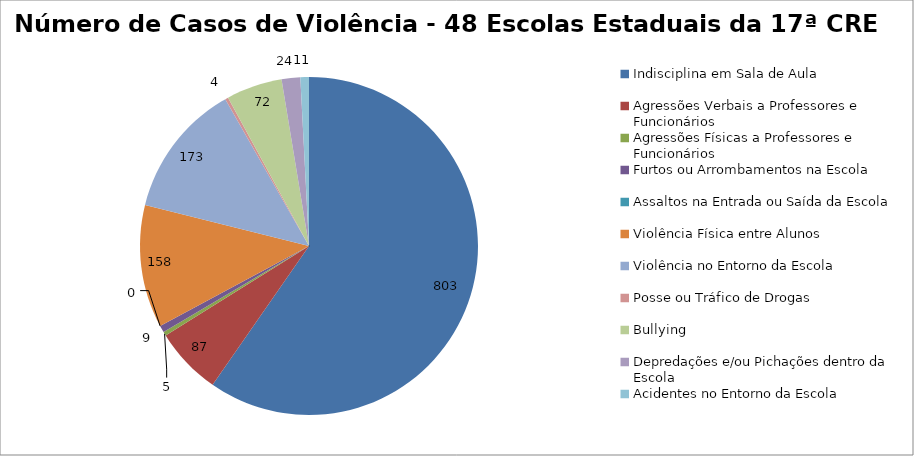
| Category | Número de Casos |
|---|---|
| Indisciplina em Sala de Aula | 803 |
| Agressões Verbais a Professores e Funcionários | 87 |
| Agressões Físicas a Professores e Funcionários | 5 |
| Furtos ou Arrombamentos na Escola | 9 |
| Assaltos na Entrada ou Saída da Escola | 0 |
| Violência Física entre Alunos | 158 |
| Violência no Entorno da Escola | 173 |
| Posse ou Tráfico de Drogas | 4 |
| Bullying | 72 |
| Depredações e/ou Pichações dentro da Escola | 24 |
| Acidentes no Entorno da Escola | 11 |